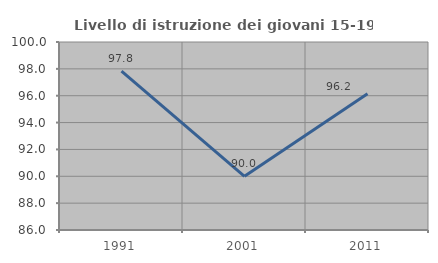
| Category | Livello di istruzione dei giovani 15-19 anni |
|---|---|
| 1991.0 | 97.826 |
| 2001.0 | 90 |
| 2011.0 | 96.154 |